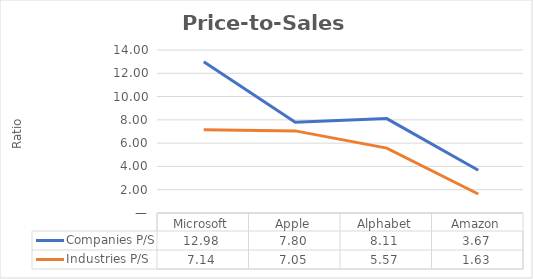
| Category | Companies P/S | Industries P/S |
|---|---|---|
| Microsoft | 12.981 | 7.14 |
| Apple | 7.803 | 7.054 |
| Alphabet | 8.11 | 5.57 |
| Amazon | 3.672 | 1.63 |